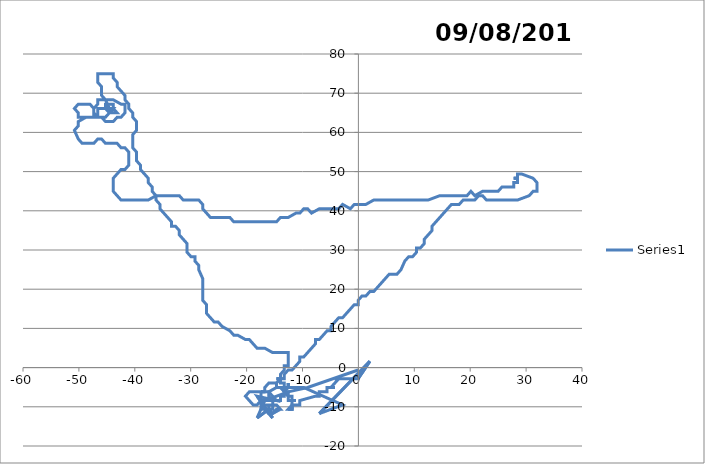
| Category | Series 0 |
|---|---|
| -0.044444045720979375 | -0.62 |
| -0.044444045720979375 | -0.62 |
| -9.08517699733602 | -5.068 |
| -12.562352560103022 | -6.18 |
| -16.735011420763044 | -8.404 |
| -16.735011420763044 | -8.404 |
| -18.126095224366964 | -12.852 |
| -16.039705600232992 | -10.628 |
| -16.73512938570002 | -10.628 |
| -15.34439947678095 | -12.852 |
| -18.125799554902983 | -7.292 |
| -14.648740518648992 | -8.404 |
| -16.039469973160976 | -6.18 |
| -16.73489345576604 | -6.18 |
| -17.430316938368037 | -6.18 |
| -16.73489345576604 | -6.18 |
| -16.734834473245996 | -5.068 |
| -16.734834473245996 | -5.068 |
| -16.734834473245996 | -5.068 |
| -16.734834473245996 | -5.068 |
| -16.039352159537998 | -3.956 |
| -16.039352159537998 | -3.956 |
| -16.039352159537998 | -3.956 |
| -16.039352159537998 | -3.956 |
| -16.039352159537998 | -3.956 |
| -16.039352159537998 | -3.956 |
| -16.039352159537998 | -3.956 |
| -16.039352159537998 | -3.956 |
| -16.039352159537998 | -3.956 |
| -16.039352159537998 | -3.956 |
| -16.039352159537998 | -3.956 |
| -16.039352159537998 | -3.956 |
| -16.039352159537998 | -3.956 |
| -16.039352159537998 | -3.956 |
| -16.039352159537998 | -3.956 |
| -16.039352159537998 | -3.956 |
| -16.039352159537998 | -3.956 |
| -16.039352159537998 | -3.956 |
| -16.039352159537998 | -3.956 |
| -16.039352159537998 | -3.956 |
| -16.039352159537998 | -3.956 |
| -16.039352159537998 | -3.956 |
| -16.039352159537998 | -3.956 |
| -16.039352159537998 | -3.956 |
| -16.039352159537998 | -3.956 |
| -16.039352159537998 | -3.956 |
| -16.039352159537998 | -3.956 |
| -16.039352159537998 | -3.956 |
| -16.039352159537998 | -3.956 |
| -16.039352159537998 | -3.956 |
| -16.039352159537998 | -3.956 |
| -16.039352159537998 | -3.956 |
| -16.039352159537998 | -3.956 |
| -16.039352159537998 | -3.956 |
| -16.039352159537998 | -3.956 |
| -16.039352159537998 | -3.956 |
| -15.343928828364028 | -3.956 |
| -15.343928828364028 | -3.956 |
| -15.343928828364028 | -3.956 |
| -15.343928828364028 | -3.956 |
| -15.343928828364028 | -3.956 |
| -15.343928828364028 | -3.956 |
| -15.343928828364028 | -3.956 |
| -15.343928828364028 | -3.956 |
| -15.343928828364028 | -3.956 |
| -15.343928828364028 | -3.956 |
| -15.343928828364028 | -3.956 |
| -15.343928828364028 | -3.956 |
| -15.343928828364028 | -3.956 |
| -15.343928828364028 | -3.956 |
| -15.343928828364028 | -3.956 |
| -15.343928828364028 | -3.956 |
| -15.343928828364028 | -3.956 |
| -15.343928828364028 | -3.956 |
| -15.343928828364028 | -3.956 |
| -15.343928828364028 | -3.956 |
| -15.343928828364028 | -3.956 |
| -15.343928828364028 | -3.956 |
| -15.343928828364028 | -3.956 |
| -15.343928828364028 | -3.956 |
| -14.648505497185056 | -3.956 |
| -14.648505497185056 | -3.956 |
| -14.648505497185056 | -3.956 |
| -14.648505497185056 | -3.956 |
| -14.648505497185056 | -3.956 |
| -14.64856425257301 | -5.068 |
| -14.64856425257301 | -5.068 |
| -14.64856425257301 | -5.068 |
| -14.64856425257301 | -5.068 |
| -14.64856425257301 | -5.068 |
| -14.64856425257301 | -5.068 |
| -14.64856425257301 | -5.068 |
| -14.64856425257301 | -5.068 |
| -14.64856425257301 | -5.068 |
| -14.64856425257301 | -5.068 |
| -14.64856425257301 | -5.068 |
| -14.64856425257301 | -5.068 |
| -14.64856425257301 | -5.068 |
| -14.64856425257301 | -5.068 |
| -14.64856425257301 | -5.068 |
| -14.64856425257301 | -5.068 |
| -14.64856425257301 | -5.068 |
| -14.64856425257301 | -5.068 |
| -14.64856425257301 | -5.068 |
| -14.64856425257301 | -5.068 |
| -14.64856425257301 | -5.068 |
| -14.64856425257301 | -5.068 |
| -14.64856425257301 | -5.068 |
| -14.64856425257301 | -5.068 |
| -14.64856425257301 | -5.068 |
| -14.64856425257301 | -5.068 |
| -14.64856425257301 | -5.068 |
| -14.64856425257301 | -5.068 |
| -14.64856425257301 | -5.068 |
| -14.64856425257301 | -5.068 |
| -14.64856425257301 | -5.068 |
| -14.64856425257301 | -5.068 |
| -14.64856425257301 | -5.068 |
| -14.64856425257301 | -5.068 |
| -14.64856425257301 | -5.068 |
| -14.64856425257301 | -5.068 |
| -14.64856425257301 | -5.068 |
| -14.64856425257301 | -5.068 |
| -14.64856425257301 | -5.068 |
| -14.64856425257301 | -5.068 |
| -14.64856425257301 | -5.068 |
| -14.64856425257301 | -5.068 |
| -14.64856425257301 | -5.068 |
| -14.64856425257301 | -5.068 |
| -14.64856425257301 | -5.068 |
| -9.78060040424998 | -5.068 |
| -9.78060040424998 | -5.068 |
| -9.78060040424998 | -5.068 |
| -2.826596207743023 | -9.516 |
| -2.826596207743023 | -9.516 |
| -6.999254311367963 | -11.74 |
| -6.999254311367963 | -11.74 |
| -6.999254311367963 | -11.74 |
| 2.0419391430909855 | 1.604 |
| 2.0419391430909855 | 1.604 |
| -0.04455837650698413 | -2.844 |
| -4.2170979095550365 | -2.844 |
| -3.521674654052049 | -2.844 |
| -4.217155529221031 | -3.956 |
| -4.912636555803033 | -5.068 |
| -4.217213148873043 | -5.068 |
| -4.217213148873043 | -5.068 |
| -4.912636555803033 | -5.068 |
| -4.912636555803033 | -5.068 |
| -4.912636555803033 | -5.068 |
| -4.912636555803033 | -5.068 |
| -4.912636555803033 | -5.068 |
| -4.912636555803033 | -5.068 |
| -5.608059962732 | -5.068 |
| -5.608059962732 | -5.068 |
| -5.608059962732 | -5.068 |
| -5.608117733801009 | -6.18 |
| -5.608117733801009 | -6.18 |
| -5.608117733801009 | -6.18 |
| -5.608117733801009 | -6.18 |
| -6.303541216440976 | -6.18 |
| -6.303541216440976 | -6.18 |
| -6.998964699080943 | -6.18 |
| -6.999022621566951 | -7.292 |
| -6.999022621566951 | -7.292 |
| -7.694446179919964 | -7.292 |
| -10.476198714353018 | -8.404 |
| -10.476198714353018 | -8.404 |
| -10.476198714353018 | -8.404 |
| -10.476198714353018 | -8.404 |
| -10.476257015388 | -9.516 |
| -11.171680725159945 | -9.516 |
| -11.171680725159945 | -9.516 |
| -11.171680725159945 | -9.516 |
| -11.171680725159945 | -9.516 |
| -11.867104434929047 | -9.516 |
| -11.867104434929047 | -9.516 |
| -11.867162887382051 | -10.628 |
| -11.867162887382051 | -10.628 |
| -11.867162887382051 | -10.628 |
| -11.867162887382051 | -10.628 |
| -12.56258667286204 | -10.628 |
| -12.56258667286204 | -10.628 |
| -12.56258667286204 | -10.628 |
| -12.56258667286204 | -10.628 |
| -11.867162887382051 | -10.628 |
| -11.867104434929047 | -9.516 |
| -11.867104434929047 | -9.516 |
| -11.867104434929047 | -9.516 |
| -11.867104434929047 | -9.516 |
| -11.867104434929047 | -9.516 |
| -11.867104434929047 | -9.516 |
| -11.867104434929047 | -9.516 |
| -11.867104434929047 | -9.516 |
| -11.867162887382051 | -10.628 |
| -11.867162887382051 | -10.628 |
| -11.867162887382051 | -10.628 |
| -11.867162887382051 | -10.628 |
| -11.867162887382051 | -10.628 |
| -12.56258667286204 | -10.628 |
| -11.867104434929047 | -9.516 |
| -11.867104434929047 | -9.516 |
| -11.867045982462969 | -8.404 |
| -11.867045982462969 | -8.404 |
| -11.867045982462969 | -8.404 |
| -11.867045982462969 | -8.404 |
| -11.866987529980975 | -7.292 |
| -11.866987529980975 | -7.292 |
| -12.562411088315002 | -7.292 |
| -13.257776042721048 | -6.18 |
| -13.953140845678035 | -5.068 |
| -13.953140845678035 | -5.068 |
| -14.64856425257301 | -5.068 |
| -16.039469973160976 | -6.18 |
| -16.039469973160976 | -6.18 |
| -16.039528879951035 | -7.292 |
| -16.039528879951035 | -7.292 |
| -15.344164152690041 | -8.404 |
| -15.344222983733971 | -9.516 |
| -14.648799273978057 | -9.516 |
| -13.95343424381997 | -10.628 |
| -13.95343424381997 | -10.628 |
| -13.95343424381997 | -10.628 |
| -15.344340645779994 | -11.74 |
| -16.039705600232992 | -10.628 |
| -16.039705600232992 | -10.628 |
| -16.039705600232992 | -10.628 |
| -16.039646693487043 | -9.516 |
| -15.344222983733971 | -9.516 |
| -14.648799273978057 | -9.516 |
| -13.95343424381997 | -10.628 |
| -13.95343424381997 | -10.628 |
| -14.648858029293024 | -10.628 |
| -15.344340645779994 | -11.74 |
| -16.039764506964048 | -11.74 |
| -16.73512938570002 | -10.628 |
| -16.73512938570002 | -10.628 |
| -16.73507040323898 | -9.516 |
| -16.039646693487043 | -9.516 |
| -15.344222983733971 | -9.516 |
| -15.344281814765054 | -10.628 |
| -15.344281814765054 | -10.628 |
| -16.039705600232992 | -10.628 |
| -16.73512938570002 | -10.628 |
| -17.430553171165002 | -10.628 |
| -17.430494112987958 | -9.516 |
| -17.43043505479602 | -8.404 |
| -17.43043505479602 | -8.404 |
| -17.430375996589987 | -7.292 |
| -17.430316938368037 | -6.18 |
| -18.125740420966054 | -6.18 |
| -18.821163903563956 | -6.18 |
| -19.516587386159017 | -6.18 |
| -20.21207022983299 | -7.292 |
| -20.21207022983299 | -7.292 |
| -19.516705956879946 | -8.404 |
| -18.82134153247705 | -9.516 |
| -18.12591782273296 | -9.516 |
| -17.43043505479602 | -8.404 |
| -17.43043505479602 | -8.404 |
| -16.735011420763044 | -8.404 |
| -16.039587786726997 | -8.404 |
| -16.039587786726997 | -8.404 |
| -15.344164152690041 | -8.404 |
| -15.344164152690041 | -8.404 |
| -14.648740518648992 | -8.404 |
| -14.648740518648992 | -8.404 |
| -13.953316884607034 | -8.404 |
| -13.953258204978965 | -7.292 |
| -13.257834646648007 | -7.292 |
| -13.257834646648007 | -7.292 |
| -13.257776042721048 | -6.18 |
| -13.257776042721048 | -6.18 |
| -13.257776042721048 | -6.18 |
| -12.562294031876945 | -5.068 |
| -12.562294031876945 | -5.068 |
| -12.562294031876945 | -5.068 |
| -12.562235503636998 | -3.956 |
| -12.562294031876945 | -5.068 |
| -12.562294031876945 | -5.068 |
| -14.64856425257301 | -5.068 |
| -14.648505497185056 | -3.956 |
| -13.953023486320035 | -2.844 |
| -14.648446741783005 | -2.844 |
| -13.953023486320035 | -2.844 |
| -13.953023486320035 | -2.844 |
| -13.25760023085195 | -2.844 |
| -13.25760023085195 | -2.844 |
| -13.25760023085195 | -2.844 |
| -13.25760023085195 | -2.844 |
| -13.257541626865986 | -1.732 |
| -13.257541626865986 | -1.732 |
| -12.562059918827003 | -0.62 |
| -11.866636814787967 | -0.62 |
| -11.866636814787967 | -0.62 |
| -11.171155333876982 | 0.492 |
| -11.171155333876982 | 0.492 |
| -11.171155333876982 | 0.492 |
| -11.171155333876982 | 0.492 |
| -10.475674004380949 | 1.604 |
| -10.475615703199992 | 2.716 |
| -9.780192826301004 | 2.716 |
| -9.084711799633965 | 3.828 |
| -9.084711799633965 | 3.828 |
| -8.389230924380968 | 4.94 |
| -7.693750200545992 | 6.052 |
| -7.693692202170951 | 7.164 |
| -6.998269628123012 | 7.164 |
| -6.302789207114984 | 8.276 |
| -5.607308937523953 | 9.387 |
| -4.911886514900971 | 9.387 |
| -4.911828819346965 | 10.499 |
| -4.216348852585952 | 11.611 |
| -3.520869037238981 | 12.723 |
| -2.8254468417560474 | 12.723 |
| -2.1299672535390073 | 13.835 |
| -1.4344878167360093 | 14.947 |
| -0.7390085313479631 | 16.059 |
| -0.04358656300496477 | 16.059 |
| -0.043529397377028545 | 17.171 |
| 0.6519495851799775 | 18.283 |
| 1.3473714020969965 | 18.283 |
| 2.0428501575230484 | 19.395 |
| 2.7382718987289536 | 19.395 |
| 3.433750427025984 | 20.507 |
| 4.129228803907949 | 21.619 |
| 4.824707029374963 | 22.731 |
| 5.520185103423955 | 23.843 |
| 6.2156065417780155 | 23.843 |
| 6.911027980134008 | 23.843 |
| 7.606505751339 | 24.955 |
| 7.606505751339 | 24.955 |
| 8.30203962829205 | 27.179 |
| 8.99751702096603 | 28.291 |
| 9.692938156464038 | 28.291 |
| 10.388415322007972 | 29.403 |
| 10.38847135206197 | 30.514 |
| 11.083892336135023 | 30.514 |
| 11.779369198844051 | 31.626 |
| 11.779425077492988 | 32.738 |
| 12.474901713085046 | 33.85 |
| 12.474901713085046 | 33.85 |
| 13.170378197259026 | 34.962 |
| 13.170433924518022 | 36.074 |
| 13.865910181574009 | 37.186 |
| 13.865910181574009 | 37.186 |
| 14.56138628721402 | 38.298 |
| 15.256862241434987 | 39.41 |
| 15.256862241434987 | 39.41 |
| 15.952338044242026 | 40.522 |
| 16.647813695630987 | 41.634 |
| 18.038654149492004 | 41.634 |
| 18.73412949803702 | 42.746 |
| 19.429549649255023 | 42.746 |
| 20.820389951701998 | 42.746 |
| 21.51586492168701 | 43.858 |
| 22.211284997199982 | 43.858 |
| 22.906650405389996 | 42.746 |
| 24.297490707861016 | 42.746 |
| 24.992910859099027 | 42.746 |
| 25.688331010339994 | 42.746 |
| 27.079171312828976 | 42.746 |
| 28.470011615325973 | 42.746 |
| 28.470011615325973 | 42.746 |
| 30.55632590353298 | 43.858 |
| 31.251799737815986 | 44.97 |
| 31.251799737815986 | 44.97 |
| 31.94721973764598 | 44.97 |
| 31.947327103731993 | 47.194 |
| 31.947327103731993 | 47.194 |
| 31.947327103731993 | 47.194 |
| 31.25196101411501 | 48.306 |
| 31.25196101411501 | 48.306 |
| 31.25196101411501 | 48.306 |
| 29.165755682035012 | 49.418 |
| 28.47033598508102 | 49.418 |
| 28.47033598508102 | 49.418 |
| 28.47028192342202 | 48.306 |
| 27.774862150756007 | 48.306 |
| 28.47028192342202 | 48.306 |
| 28.47028192342202 | 48.306 |
| 28.47022786177598 | 47.194 |
| 28.47022786177598 | 47.194 |
| 27.774808013393 | 47.194 |
| 27.774753876043974 | 46.082 |
| 26.383914027849983 | 46.082 |
| 25.688494103756 | 46.082 |
| 24.993019739462 | 44.97 |
| 24.297599739657983 | 44.97 |
| 22.906759740051996 | 44.97 |
| 22.211339740255028 | 44.97 |
| 20.820444846175974 | 43.858 |
| 20.12507974087299 | 44.97 |
| 19.429604695162027 | 43.858 |
| 18.038764544158028 | 43.858 |
| 17.343344468658984 | 43.858 |
| 16.647924393163976 | 43.858 |
| 15.952504317669025 | 43.858 |
| 15.257084242176973 | 43.858 |
| 14.561664166689013 | 43.858 |
| 14.561664166689013 | 43.858 |
| 12.475348137162996 | 42.746 |
| 11.084507834773035 | 42.746 |
| 10.38908768358101 | 42.746 |
| 9.693667532391032 | 42.746 |
| 8.998247381205033 | 42.746 |
| 8.302827230019943 | 42.746 |
| 7.607407078838037 | 42.746 |
| 6.9119869276589725 | 42.746 |
| 6.216566776481045 | 42.746 |
| 5.52114662530596 | 42.746 |
| 4.825726474134967 | 42.746 |
| 3.4348861717960517 | 42.746 |
| 2.739466020631994 | 42.746 |
| 1.3485687037870093 | 41.634 |
| 0.6531484769119515 | 41.634 |
| -0.7376919768289554 | 41.634 |
| -1.433169521069999 | 40.522 |
| -1.433169521069999 | 40.522 |
| -2.8239526574229785 | 41.634 |
| -3.519430428806004 | 40.522 |
| -4.214850731381034 | 40.522 |
| -5.605691336520977 | 40.522 |
| -6.3011116390860025 | 40.522 |
| -6.996531941650005 | 40.522 |
| -8.387430621294016 | 39.41 |
| -9.082792849327006 | 40.522 |
| -9.778213151882028 | 40.522 |
| -10.47369175610595 | 39.41 |
| -11.169112134371971 | 39.41 |
| -12.560011419703983 | 38.298 |
| -12.560011419703983 | 38.298 |
| -13.950852327652001 | 38.298 |
| -14.646331537563015 | 37.186 |
| -16.037172596927007 | 37.186 |
| -16.732593126606048 | 37.186 |
| -17.42801365628202 | 37.186 |
| -18.123434185955034 | 37.186 |
| -18.123434185955034 | 37.186 |
| -19.51427524529504 | 37.186 |
| -20.905116304624016 | 37.186 |
| -20.905116304624016 | 37.186 |
| -21.60053683428498 | 37.186 |
| -22.295957363941966 | 37.186 |
| -22.991318229058038 | 38.298 |
| -23.68673868299402 | 38.298 |
| -24.382159136928976 | 38.298 |
| -25.077579590860978 | 38.298 |
| -25.773000044789 | 38.298 |
| -26.468420498716 | 38.298 |
| -27.163780833786973 | 39.41 |
| -27.859141017406046 | 40.522 |
| -27.85908082280605 | 41.634 |
| -28.554440779244032 | 42.746 |
| -29.945281081342046 | 42.746 |
| -30.640701232387983 | 42.746 |
| -31.336121383430964 | 42.746 |
| -32.03148088554099 | 43.858 |
| -32.72690096086296 | 43.858 |
| -34.117741111496 | 43.858 |
| -34.81316118681002 | 43.858 |
| -35.50858126211995 | 43.858 |
| -36.20400133742805 | 43.858 |
| -37.594902742696945 | 42.746 |
| -38.29032289371503 | 42.746 |
| -38.98574304473004 | 42.746 |
| -39.681163195740055 | 42.746 |
| -40.376583346749044 | 42.746 |
| -41.07200349775496 | 42.746 |
| -42.462843799761 | 42.746 |
| -43.15820209036406 | 43.858 |
| -43.15820209036406 | 43.858 |
| -43.85356022951896 | 44.97 |
| -43.85349829337804 | 46.082 |
| -43.853436357221995 | 47.194 |
| -43.853436357221995 | 47.194 |
| -43.853374421050034 | 48.306 |
| -43.853374421050034 | 48.306 |
| -43.15789278816601 | 49.418 |
| -43.15789278816601 | 49.418 |
| -42.462411306700005 | 50.53 |
| -41.76699168571395 | 50.53 |
| -41.07151043137401 | 51.642 |
| -41.071448798007964 | 52.753 |
| -41.071387164626 | 53.865 |
| -41.071325531229036 | 54.977 |
| -41.071325531229036 | 54.977 |
| -41.76668314022095 | 56.089 |
| -42.46210238262404 | 56.089 |
| -43.15745976444305 | 57.201 |
| -43.85287893112297 | 57.201 |
| -44.548298097800966 | 57.201 |
| -45.24371726447396 | 57.201 |
| -45.93907426768601 | 58.313 |
| -46.63449335863902 | 58.313 |
| -47.329974764480994 | 57.201 |
| -48.02539393114603 | 57.201 |
| -48.72081309780697 | 57.201 |
| -48.72081309780697 | 57.201 |
| -49.41623226446495 | 57.201 |
| -50.11158881335996 | 58.313 |
| -50.806882517292024 | 60.537 |
| -50.806882517292024 | 60.537 |
| -50.806882517292024 | 60.537 |
| -50.11140095998303 | 61.649 |
| -50.111338342160025 | 62.761 |
| -48.720438299608986 | 63.873 |
| -47.32960087488402 | 63.873 |
| -46.634182162520005 | 63.873 |
| -45.93876345015099 | 63.873 |
| -45.24340682560103 | 62.761 |
| -43.852569249418025 | 62.761 |
| -43.157088600651946 | 63.873 |
| -42.46166988827099 | 63.873 |
| -41.766189466634955 | 64.985 |
| -41.76612775736703 | 66.097 |
| -41.766066048083985 | 67.209 |
| -42.46148453331796 | 67.209 |
| -43.85225956732802 | 68.321 |
| -44.54767797683701 | 68.321 |
| -45.93851479584498 | 68.321 |
| -46.633933205347034 | 68.321 |
| -46.633995444663014 | 67.209 |
| -47.32947624489498 | 66.097 |
| -47.329538559896946 | 64.985 |
| -47.329538559896946 | 64.985 |
| -47.32960087488402 | 63.873 |
| -48.02501958724804 | 63.873 |
| -48.720438299608986 | 63.873 |
| -49.415857011965045 | 63.873 |
| -50.11127572432099 | 63.873 |
| -50.11121310646604 | 64.985 |
| -50.80656904951297 | 66.097 |
| -50.80656904951297 | 66.097 |
| -50.111087870711 | 67.209 |
| -49.41566938550602 | 67.209 |
| -48.720250900300016 | 67.209 |
| -48.02483241509003 | 67.209 |
| -47.32947624489498 | 66.097 |
| -47.329538559896946 | 64.985 |
| -47.329538559896946 | 64.985 |
| -46.634182162520005 | 63.873 |
| -45.93876345015099 | 63.873 |
| -45.243344737780035 | 63.873 |
| -44.54786401328795 | 64.985 |
| -44.54786401328795 | 64.985 |
| -45.243220562092006 | 66.097 |
| -45.93863912302902 | 66.097 |
| -46.63405768396399 | 66.097 |
| -46.634119923249955 | 64.985 |
| -46.634182162520005 | 63.873 |
| -45.93876345015099 | 63.873 |
| -45.243344737780035 | 63.873 |
| -44.54786401328795 | 64.985 |
| -44.547802001152945 | 66.097 |
| -45.243220562092006 | 66.097 |
| -45.243220562092006 | 66.097 |
| -45.24315847422395 | 67.209 |
| -44.54773998900305 | 67.209 |
| -43.852321503777034 | 67.209 |
| -43.85238344021002 | 66.097 |
| -43.157026739966 | 64.985 |
| -43.852445376628 | 64.985 |
| -43.852445376628 | 64.985 |
| -44.54786401328795 | 64.985 |
| -44.547802001152945 | 66.097 |
| -44.547802001152945 | 66.097 |
| -43.85238344021002 | 66.097 |
| -43.85238344021002 | 66.097 |
| -43.85238344021002 | 66.097 |
| -44.54786401328795 | 64.985 |
| -44.547802001152945 | 66.097 |
| -44.547802001152945 | 66.097 |
| -45.24309638634202 | 68.321 |
| -45.24309638634202 | 68.321 |
| -45.938452632229996 | 69.433 |
| -45.938390468600005 | 70.545 |
| -45.938328304953984 | 71.657 |
| -45.938328304953984 | 71.657 |
| -46.633684247924975 | 72.769 |
| -46.633622008531006 | 73.881 |
| -46.633622008531006 | 73.881 |
| -46.63355976912203 | 74.992 |
| -45.93814181392304 | 74.992 |
| -45.93814181392304 | 74.992 |
| -45.24272385872098 | 74.992 |
| -44.54730590351801 | 74.992 |
| -43.851887948310946 | 74.992 |
| -43.85194988485205 | 73.881 |
| -43.85194988485205 | 73.881 |
| -43.15659371473396 | 72.769 |
| -43.15665557552802 | 71.657 |
| -42.46129917822702 | 70.545 |
| -42.46129917822702 | 70.545 |
| -41.76594262947299 | 69.433 |
| -41.76600433878605 | 68.321 |
| -41.07064756284797 | 67.209 |
| -41.070709196413986 | 66.097 |
| -41.070709196413986 | 66.097 |
| -40.375352193293 | 64.985 |
| -40.375352193293 | 64.985 |
| -40.375413751110955 | 63.873 |
| -39.68005652080501 | 62.761 |
| -39.68005652080501 | 62.761 |
| -39.68011800287604 | 61.649 |
| -39.680179484931045 | 60.537 |
| -40.375659982231014 | 59.425 |
| -40.37572153997303 | 58.313 |
| -40.37578309769901 | 57.201 |
| -40.37578309769901 | 57.201 |
| -40.375844655411015 | 56.089 |
| -39.680486894979026 | 54.977 |
| -39.680486894979026 | 54.977 |
| -39.680548376942966 | 53.865 |
| -39.68060985889201 | 52.753 |
| -38.985251795547015 | 51.642 |
| -38.985251795547015 | 51.642 |
| -38.98531320174902 | 50.53 |
| -38.289954911218956 | 49.418 |
| -37.594596469239036 | 48.306 |
| -37.59465772396095 | 47.194 |
| -36.89929905479903 | 46.082 |
| -36.89936023377402 | 44.97 |
| -36.89936023377402 | 44.97 |
| -36.20400133742805 | 43.858 |
| -36.204062440657026 | 42.746 |
| -35.50870331712804 | 41.634 |
| -35.50876434460895 | 40.522 |
| -35.50876434460895 | 40.522 |
| -34.81340499390001 | 39.41 |
| -34.11804549173803 | 38.298 |
| -34.11804549173803 | 38.298 |
| -33.42268583812597 | 37.186 |
| -33.42274663839703 | 36.074 |
| -32.72732603306497 | 36.074 |
| -32.03196607655195 | 34.962 |
| -32.03202672535997 | 33.85 |
| -32.03202672535997 | 33.85 |
| -31.336666541667 | 32.738 |
| -30.641306206520994 | 31.626 |
| -30.641366703851986 | 30.514 |
| -30.641427201166948 | 29.403 |
| -29.946066563108957 | 28.291 |
| -29.250645427748964 | 28.291 |
| -29.25070577360202 | 27.179 |
| -28.555344832643982 | 26.067 |
| -28.55540510275 | 24.955 |
| -28.55540510275 | 24.955 |
| -27.86010412897099 | 22.731 |
| -27.86010412897099 | 22.731 |
| -27.860164323317008 | 21.619 |
| -27.860224517646998 | 20.507 |
| -27.860284711963004 | 19.395 |
| -27.86034490626298 | 18.283 |
| -27.86034490626298 | 18.283 |
| -27.860405100548974 | 17.171 |
| -27.860405100548974 | 17.171 |
| -27.16504332657496 | 16.059 |
| -27.165103445114028 | 14.947 |
| -27.165163563639 | 13.835 |
| -26.469801486750953 | 12.723 |
| -26.469801486750953 | 12.723 |
| -25.774439258413963 | 11.611 |
| -25.079016987296995 | 11.611 |
| -24.38365453179199 | 10.499 |
| -24.38365453179199 | 10.499 |
| -22.992869502280996 | 9.387 |
| -22.297506668158007 | 8.276 |
| -21.602084169880982 | 8.276 |
| -20.211298534591037 | 7.164 |
| -19.51587596059005 | 7.164 |
| -18.820512596414005 | 6.052 |
| -18.125149080789015 | 4.94 |
| -17.429726355348976 | 4.94 |
| -16.734303629904048 | 4.94 |
| -15.343517010230016 | 3.828 |
| -14.648094209062037 | 3.828 |
| -13.257248606720054 | 3.828 |
| -12.561825805545027 | 3.828 |
| -12.561884333886951 | 2.716 |
| -12.561942862215005 | 1.604 |
| -12.562001390528962 | 0.492 |
| -13.257424418851997 | 0.492 |
| -13.25748302286604 | -0.62 |
| -13.25748302286604 | -0.62 |
| -13.952964806617956 | -1.732 |
| -13.953023486320035 | -2.844 |
| -13.953023486320035 | -2.844 |
| -13.95308216600597 | -3.956 |
| -13.257658834823019 | -3.956 |
| -13.257658834823019 | -3.956 |
| -13.257658834823019 | -3.956 |
| -13.257717438778968 | -5.068 |
| -13.257717438778968 | -5.068 |
| -13.257717438778968 | -5.068 |
| -13.257776042721048 | -6.18 |
| -13.257776042721048 | -6.18 |
| -13.257776042721048 | -6.18 |
| -12.562352560103022 | -6.18 |
| -12.562352560103022 | -6.18 |
| -12.562352560103022 | -6.18 |
| -12.562411088315002 | -7.292 |
| -12.562411088315002 | -7.292 |
| -12.562411088315002 | -7.292 |
| -12.562411088315002 | -7.292 |
| -12.562411088315002 | -7.292 |
| -12.562411088315002 | -7.292 |
| -12.562411088315002 | -7.292 |
| -12.562411088315002 | -7.292 |
| -12.562411088315002 | -7.292 |
| -12.562411088315002 | -7.292 |
| -12.562411088315002 | -7.292 |
| -12.562411088315002 | -7.292 |
| -12.562411088315002 | -7.292 |
| -12.562411088315002 | -7.292 |
| -12.562411088315002 | -7.292 |
| -12.562411088315002 | -7.292 |
| -12.562411088315002 | -7.292 |
| -12.562411088315002 | -7.292 |
| -12.562411088315002 | -7.292 |
| -12.562411088315002 | -7.292 |
| -12.562411088315002 | -7.292 |
| -12.562411088315002 | -7.292 |
| -12.562411088315002 | -7.292 |
| -12.562411088315002 | -7.292 |
| -12.562411088315002 | -7.292 |
| -12.562411088315002 | -7.292 |
| -12.562411088315002 | -7.292 |
| -12.562411088315002 | -7.292 |
| -12.562411088315002 | -7.292 |
| -12.562411088315002 | -7.292 |
| -12.562411088315002 | -7.292 |
| -12.562469616511976 | -8.404 |
| -12.562469616511976 | -8.404 |
| -12.562469616511976 | -8.404 |
| -12.562469616511976 | -8.404 |
| -12.562469616511976 | -8.404 |
| -12.562469616511976 | -8.404 |
| -12.562469616511976 | -8.404 |
| -12.562469616511976 | -8.404 |
| -12.562469616511976 | -8.404 |
| -11.867045982462969 | -8.404 |
| -11.867045982462969 | -8.404 |
| -11.867045982462969 | -8.404 |
| -11.867045982462969 | -8.404 |
| -11.867045982462969 | -8.404 |
| -11.867045982462969 | -8.404 |
| -11.867045982462969 | -8.404 |
| -11.867045982462969 | -8.404 |
| -11.867045982462969 | -8.404 |
| -11.867045982462969 | -8.404 |
| -11.867045982462969 | -8.404 |
| -11.867045982462969 | -8.404 |
| -11.867045982462969 | -8.404 |
| -11.867045982462969 | -8.404 |
| -11.867045982462969 | -8.404 |
| -11.867045982462969 | -8.404 |
| -11.17162234840896 | -8.404 |
| -11.17162234840896 | -8.404 |
| -11.17162234840896 | -8.404 |
| -11.17162234840896 | -8.404 |
| -11.17162234840896 | -8.404 |
| -11.17162234840896 | -8.404 |
| -11.17162234840896 | -8.404 |
| -11.17162234840896 | -8.404 |
| -11.17162234840896 | -8.404 |
| -11.17162234840896 | -8.404 |
| -11.17162234840896 | -8.404 |
| -11.17162234840896 | -8.404 |